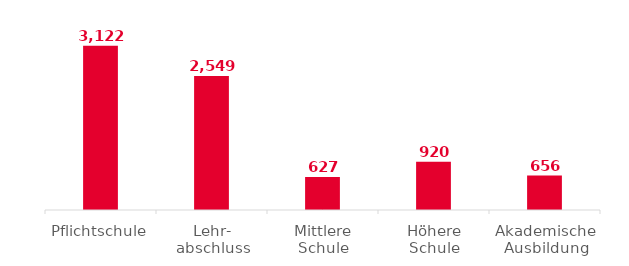
| Category | Ktn |
|---|---|
| Pflichtschule | 3122 |
| Lehr-
abschluss | 2549 |
| Mittlere
Schule | 627 |
| Höhere
Schule | 920 |
| Akademische
Ausbildung | 656 |